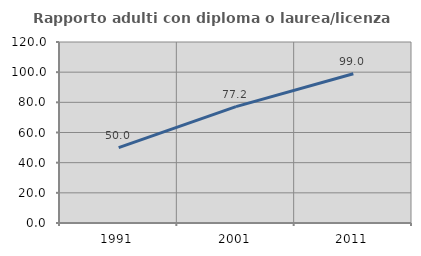
| Category | Rapporto adulti con diploma o laurea/licenza media  |
|---|---|
| 1991.0 | 50 |
| 2001.0 | 77.188 |
| 2011.0 | 98.982 |